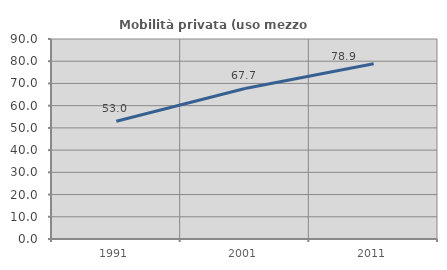
| Category | Mobilità privata (uso mezzo privato) |
|---|---|
| 1991.0 | 52.973 |
| 2001.0 | 67.742 |
| 2011.0 | 78.873 |